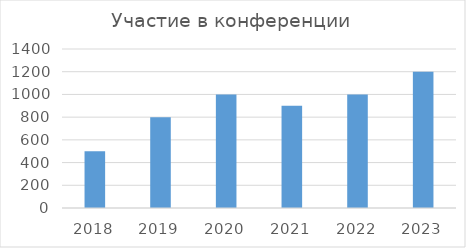
| Category | Участие в конференции |
|---|---|
| 2018.0 | 500 |
| 2019.0 | 800 |
| 2020.0 | 1000 |
| 2021.0 | 900 |
| 2022.0 | 1000 |
| 2023.0 | 1200 |